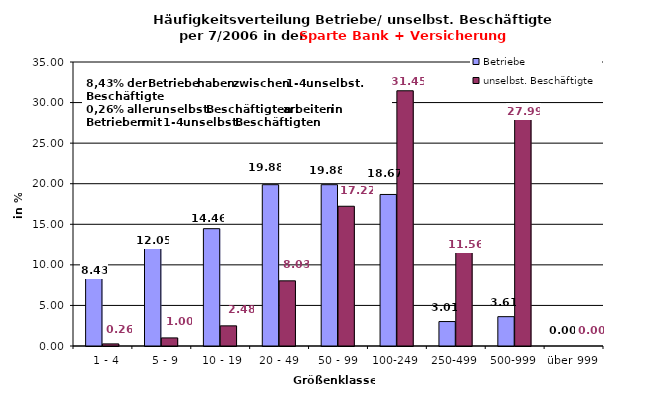
| Category | Betriebe | unselbst. Beschäftigte |
|---|---|---|
|   1 - 4 | 8.434 | 0.26 |
|   5 - 9 | 12.048 | 0.996 |
|  10 - 19 | 14.458 | 2.484 |
| 20 - 49 | 19.88 | 8.029 |
| 50 - 99 | 19.88 | 17.221 |
| 100-249 | 18.675 | 31.454 |
| 250-499 | 3.012 | 11.56 |
| 500-999 | 3.614 | 27.995 |
| über 999 | 0 | 0 |